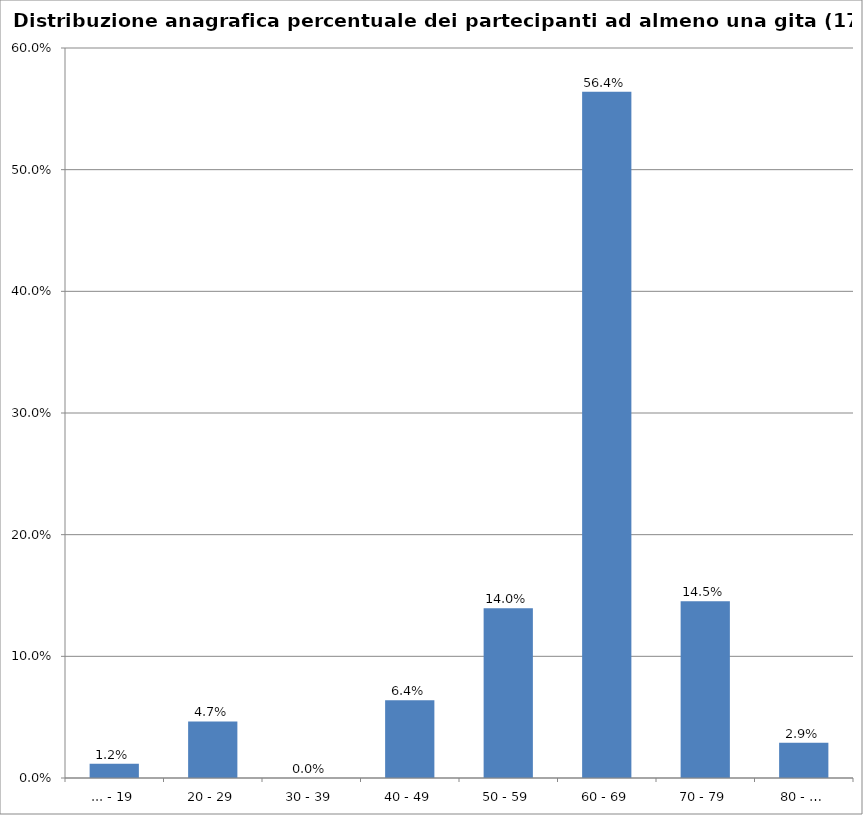
| Category | % Tesserati |
|---|---|
| ... - 19 | 0.012 |
| 20 - 29 | 0.047 |
| 30 - 39 | 0 |
| 40 - 49 | 0.064 |
| 50 - 59 | 0.14 |
| 60 - 69 | 0.564 |
| 70 - 79 | 0.145 |
| 80 - … | 0.029 |